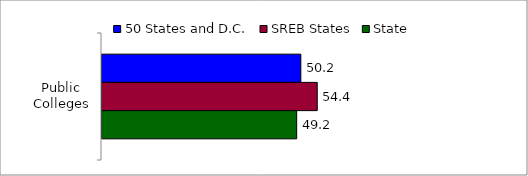
| Category | 50 States and D.C. | SREB States | State |
|---|---|---|---|
| Public Colleges | 50.213 | 54.354 | 49.16 |